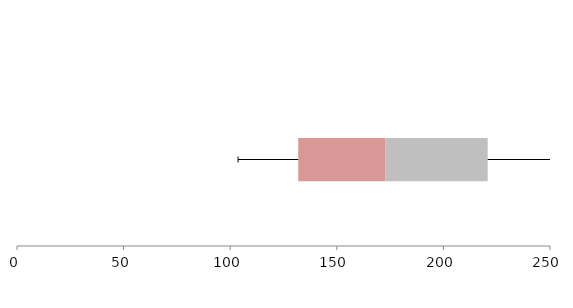
| Category | Series 1 | Series 2 | Series 3 |
|---|---|---|---|
| 0 | 131.91 | 40.914 | 47.951 |